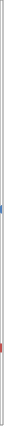
| Category | Nombre de demandes ayant au moins 1 jour sur le mois |
|---|---|
| 2020-03-01 | 1108000 |
| 2020-04-01 | 1240000 |
| 2020-05-01 | 1280000 |
| 2020-06-01 | 1145000 |